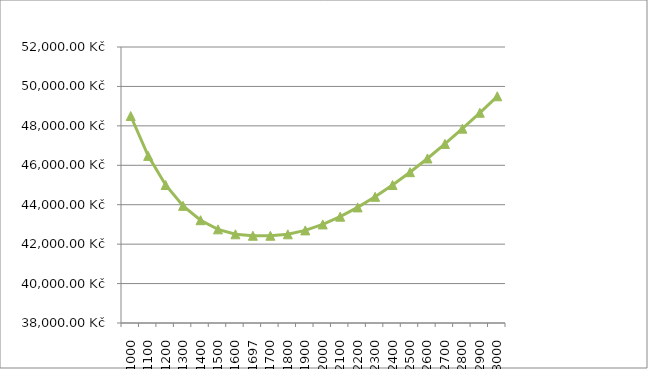
| Category | Series 2 |
|---|---|
| 1000.0 | 48500 |
| 1100.0 | 46477.273 |
| 1200.0 | 45000 |
| 1300.0 | 43942.308 |
| 1400.0 | 43214.286 |
| 1500.0 | 42750 |
| 1600.0 | 42500 |
| 1697.0 | 42426.407 |
| 1700.0 | 42426.471 |
| 1800.0 | 42500 |
| 1900.0 | 42697.368 |
| 2000.0 | 43000 |
| 2100.0 | 43392.857 |
| 2200.0 | 43863.636 |
| 2300.0 | 44402.174 |
| 2400.0 | 45000 |
| 2500.0 | 45650 |
| 2600.0 | 46346.154 |
| 2700.0 | 47083.333 |
| 2800.0 | 47857.143 |
| 2900.0 | 48663.793 |
| 3000.0 | 49500 |